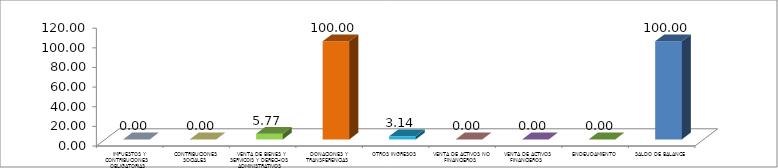
| Category | Series 0 |
|---|---|
|  IMPUESTOS Y CONTRIBUCIONES OBLIGATORIAS | 0 |
|  CONTRIBUCIONES SOCIALES | 0 |
|  VENTA DE BIENES Y SERVICOIS Y DERECHOS ADMINISTRATIVOS | 5.771 |
|  DONACIONES Y TRANSFERENCIAS | 100 |
|  OTROS INGRESOS | 3.143 |
|  VENTA DE ACTIVOS NO FINANCIEROS | 0 |
|  VENTA DE ACTIVOS FINANCIEROS | 0 |
|  ENDEUDAMIENTO | 0 |
|  SALDO DE BALANCE | 100 |